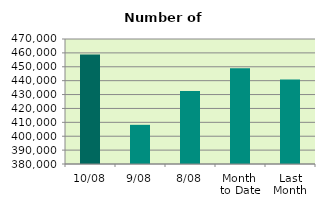
| Category | Series 0 |
|---|---|
| 10/08 | 458796 |
| 9/08 | 408208 |
| 8/08 | 432534 |
| Month 
to Date | 448949.5 |
| Last
Month | 440756.667 |